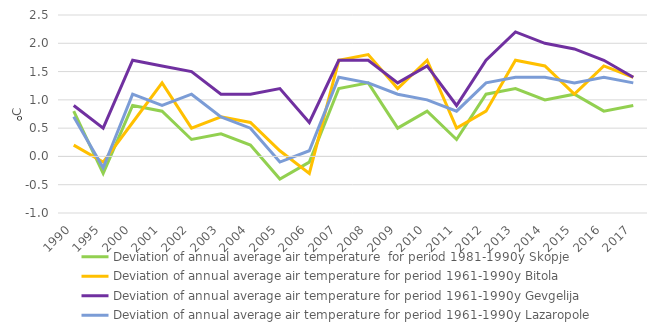
| Category | Deviation of annual average air temperature  for period 1981-1990y Skopje | Deviation of annual average air temperature for period 1961-1990y Bitola | Deviation of annual average air temperature for period 1961-1990y Gevgelija | Deviation of annual average air temperature for period 1961-1990y Lazaropole |
|---|---|---|---|---|
| 1990.0 | 0.8 | 0.2 | 0.9 | 0.7 |
| 1995.0 | -0.3 | -0.1 | 0.5 | -0.2 |
| 2000.0 | 0.9 | 0.6 | 1.7 | 1.1 |
| 2001.0 | 0.8 | 1.3 | 1.6 | 0.9 |
| 2002.0 | 0.3 | 0.5 | 1.5 | 1.1 |
| 2003.0 | 0.4 | 0.7 | 1.1 | 0.7 |
| 2004.0 | 0.2 | 0.6 | 1.1 | 0.5 |
| 2005.0 | -0.4 | 0.1 | 1.2 | -0.1 |
| 2006.0 | -0.1 | -0.3 | 0.6 | 0.1 |
| 2007.0 | 1.2 | 1.7 | 1.7 | 1.4 |
| 2008.0 | 1.3 | 1.8 | 1.7 | 1.3 |
| 2009.0 | 0.5 | 1.2 | 1.3 | 1.1 |
| 2010.0 | 0.8 | 1.7 | 1.6 | 1 |
| 2011.0 | 0.3 | 0.5 | 0.9 | 0.8 |
| 2012.0 | 1.1 | 0.8 | 1.7 | 1.3 |
| 2013.0 | 1.2 | 1.7 | 2.2 | 1.4 |
| 2014.0 | 1 | 1.6 | 2 | 1.4 |
| 2015.0 | 1.1 | 1.1 | 1.9 | 1.3 |
| 2016.0 | 0.8 | 1.6 | 1.7 | 1.4 |
| 2017.0 | 0.9 | 1.4 | 1.4 | 1.3 |